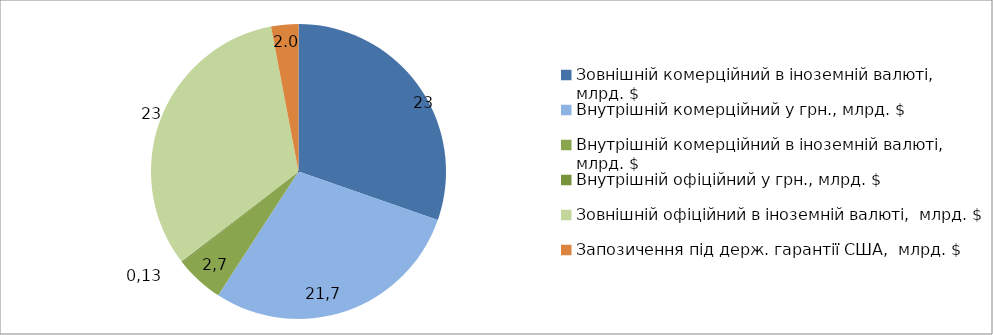
| Category | Series 0 |
|---|---|
| Зовнішній комерційний в іноземній валюті,  млрд. $ | 20.365 |
| Внутрішній комерційний у грн., млрд. $ | 19.344 |
| Внутрішній комерційний в іноземній валюті,  млрд. $ | 3.514 |
| Внутрішній офіційний у грн., млрд. $ | 0.104 |
| Зовнішній офіційний в іноземній валюті,  млрд. $ | 21.789 |
| Запозичення під держ. гарантії США,  млрд. $ | 2 |